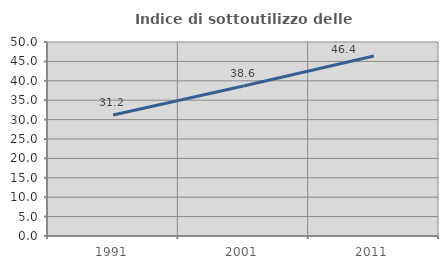
| Category | Indice di sottoutilizzo delle abitazioni  |
|---|---|
| 1991.0 | 31.202 |
| 2001.0 | 38.641 |
| 2011.0 | 46.371 |